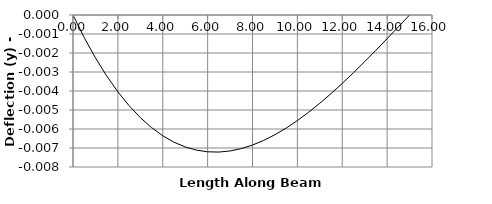
| Category | y |
|---|---|
| 0.0 | 0 |
| 1e-05 | 0 |
| 0.5 | -0.001 |
| 1.0 | -0.002 |
| 1.5 | -0.003 |
| 2.0 | -0.004 |
| 2.5 | -0.005 |
| 3.0 | -0.005 |
| 3.5 | -0.006 |
| 4.0 | -0.006 |
| 4.5 | -0.007 |
| 5.0 | -0.007 |
| 5.5 | -0.007 |
| 6.0 | -0.007 |
| 6.5 | -0.007 |
| 7.0 | -0.007 |
| 7.5 | -0.007 |
| 8.0 | -0.007 |
| 8.5 | -0.007 |
| 9.0 | -0.006 |
| 9.5 | -0.006 |
| 10.0 | -0.006 |
| 10.5 | -0.005 |
| 11.0 | -0.005 |
| 11.5 | -0.004 |
| 12.0 | -0.004 |
| 12.5 | -0.003 |
| 13.0 | -0.002 |
| 13.5 | -0.002 |
| 14.0 | -0.001 |
| 14.5 | -0.001 |
| 15.0 | 0 |
| 15.0 | 0 |